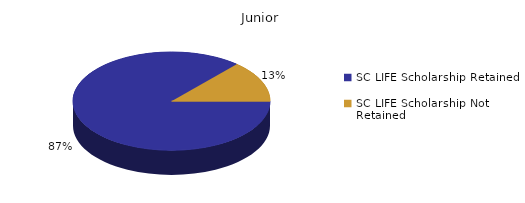
| Category | Junior |
|---|---|
| SC LIFE Scholarship Retained  | 1469 |
| SC LIFE Scholarship Not Retained  | 229 |